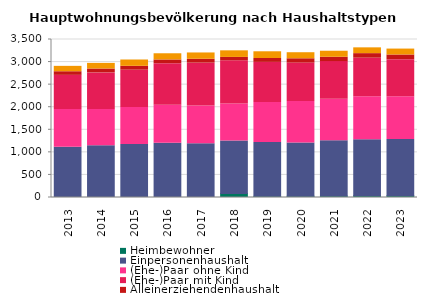
| Category | Heimbewohner | Einpersonenhaushalt | (Ehe-)Paar ohne Kind | (Ehe-)Paar mit Kind | Alleinerziehendenhaushalt | sonstiger Mehrpersonenhaushalt |
|---|---|---|---|---|---|---|
| 2013.0 | 0 | 1115 | 836 | 755 | 80 | 119 |
| 2014.0 | 0 | 1145 | 803 | 812 | 86 | 125 |
| 2015.0 | 0 | 1175 | 818 | 827 | 86 | 140 |
| 2016.0 | 0 | 1202 | 842 | 920 | 83 | 137 |
| 2017.0 | 0 | 1193 | 836 | 947 | 86 | 140 |
| 2018.0 | 86 | 1166 | 818 | 959 | 74 | 146 |
| 2019.0 | 26 | 1190 | 890 | 887 | 86 | 149 |
| 2020.0 | 29 | 1178 | 917 | 854 | 95 | 134 |
| 2021.0 | 32 | 1223 | 923 | 833 | 95 | 134 |
| 2022.0 | 38 | 1244 | 950 | 854 | 101 | 128 |
| 2023.0 | 38 | 1247 | 947 | 821 | 104 | 131 |